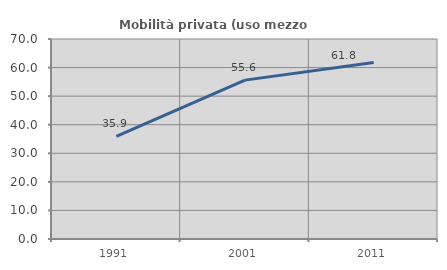
| Category | Mobilità privata (uso mezzo privato) |
|---|---|
| 1991.0 | 35.941 |
| 2001.0 | 55.605 |
| 2011.0 | 61.813 |